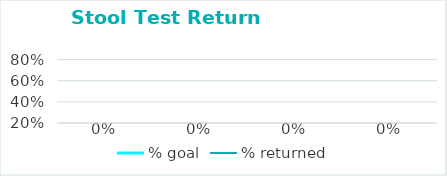
| Category | % goal | % returned |
|---|---|---|
|  |  | 0 |
|  |  | 0 |
|  |  | 0 |
|  |  | 0 |